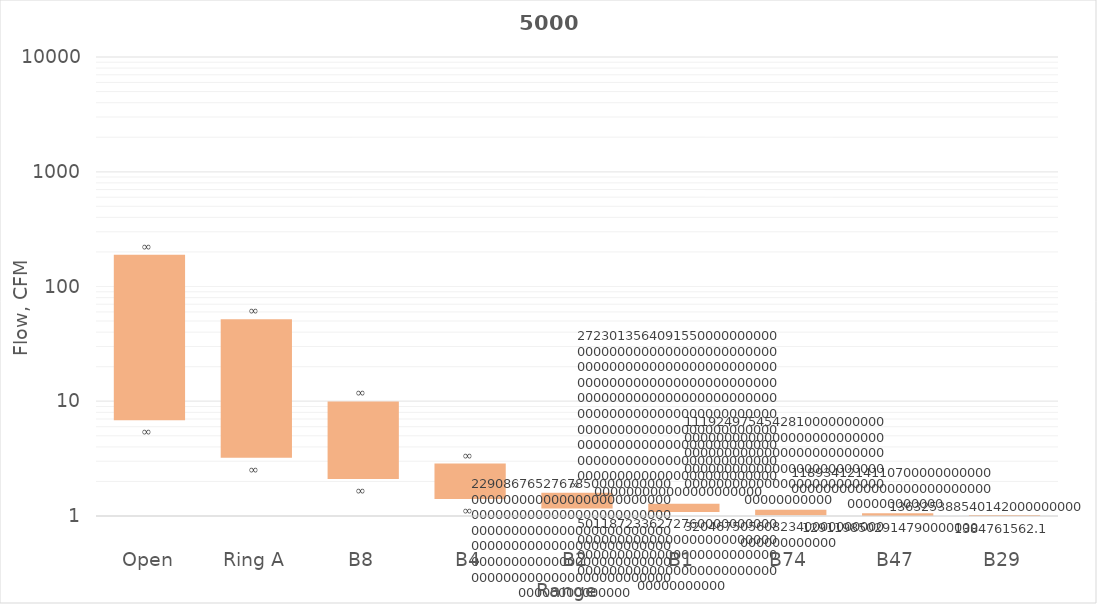
| Category | min Flow, CFM | Series 2 | max Flow, CFM |
|---|---|---|---|
| Open | 2110.931 | 3582.763 | 5693.694 |
| Ring A | 1291.216 | 2994.633 | 4285.85 |
| B8 | 830.139 | 1667.184 | 2497.322 |
| B4 | 392.674 | 751.765 | 1144.439 |
| B2 | 188.36 | 320.914 | 509.274 |
| B1 | 110.7 | 159.735 | 270.435 |
| B74 | 36.506 | 98.543 | 135.049 |
| B47 | 21.111 | 39.964 | 61.075 |
| B29 | 9.141 | 13.993 | 23.135 |